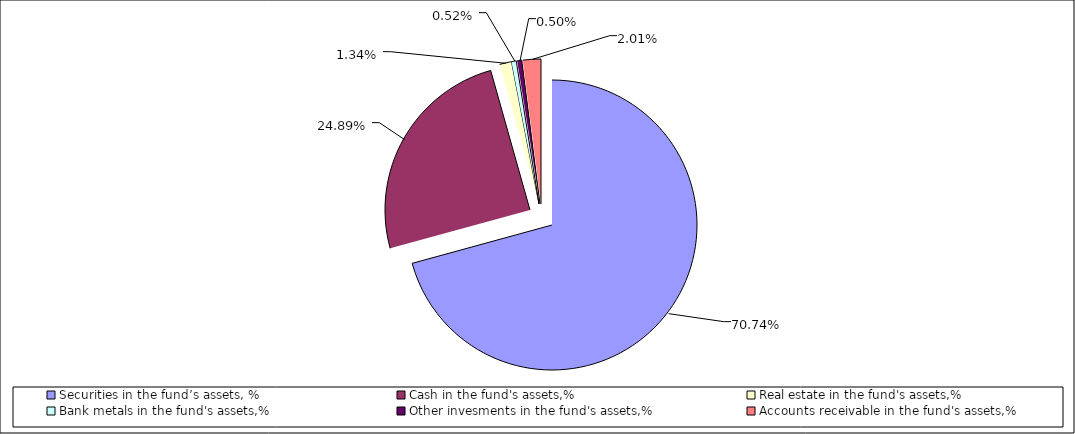
| Category | Series 0 |
|---|---|
| Securities in the fund’s assets, % | 0.707 |
| Cash in the fund's assets,% | 0.249 |
| Real estate in the fund's assets,% | 0.013 |
| Bank metals in the fund's assets,% | 0.005 |
| Other invesments in the fund's assets,%     | 0.005 |
| Accounts receivable in the fund's assets,%    | 0.02 |